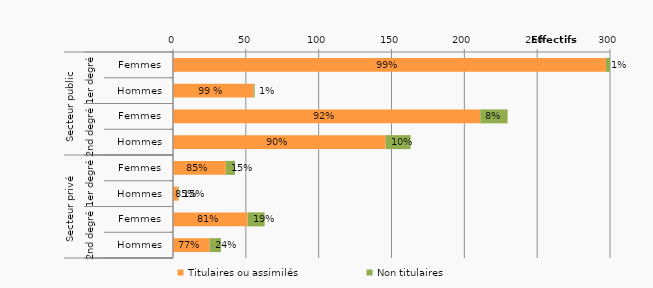
| Category | Titulaires ou assimilés | Non titulaires |
|---|---|---|
| 0 | 297228 | 3761 |
| 1 | 55299 | 845 |
| 2 | 210919 | 18777 |
| 3 | 145986 | 17138 |
| 4 | 36233 | 6388 |
| 5 | 3325 | 585 |
| 6 | 51255 | 11675 |
| 7 | 25153 | 7750 |